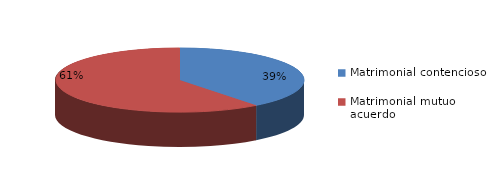
| Category | Series 0 |
|---|---|
| 0 | 260 |
| 1 | 399 |